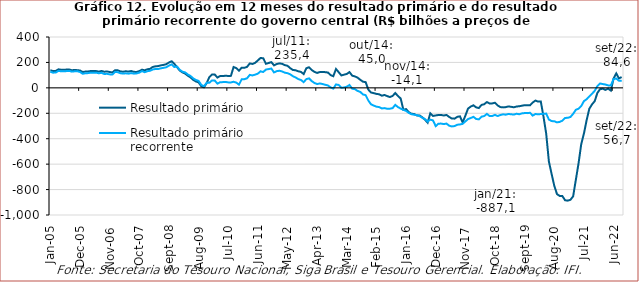
| Category | Resultado primário | Resultado primário recorrente |
|---|---|---|
| 2005-01-01 | 138531.934 | 126845.247 |
| 2005-02-01 | 131751.371 | 119556.587 |
| 2005-03-01 | 132781.991 | 120593.808 |
| 2005-04-01 | 145736.786 | 133448.149 |
| 2005-05-01 | 142403.822 | 130191.756 |
| 2005-06-01 | 141617.503 | 129638.461 |
| 2005-07-01 | 143922.7 | 131958.362 |
| 2005-08-01 | 144213.506 | 133589.352 |
| 2005-09-01 | 138586.273 | 127610.598 |
| 2005-10-01 | 140638.722 | 130078.924 |
| 2005-11-01 | 139155.237 | 131052.492 |
| 2005-12-01 | 136453.336 | 124784.345 |
| 2006-01-01 | 124463.596 | 110954.616 |
| 2006-02-01 | 128146.78 | 114944.174 |
| 2006-03-01 | 129056.641 | 115933.395 |
| 2006-04-01 | 132476.445 | 119697.92 |
| 2006-05-01 | 131896.698 | 119230.884 |
| 2006-06-01 | 132025.042 | 119389.463 |
| 2006-07-01 | 127285.375 | 114584.732 |
| 2006-08-01 | 133072.886 | 118286.966 |
| 2006-09-01 | 126878.573 | 108790.375 |
| 2006-10-01 | 128857.932 | 110724.688 |
| 2006-11-01 | 124811.13 | 106029.049 |
| 2006-12-01 | 120778.809 | 104847.308 |
| 2007-01-01 | 138678.331 | 124335.952 |
| 2007-02-01 | 138153.997 | 123558.717 |
| 2007-03-01 | 129393.725 | 114835.392 |
| 2007-04-01 | 126920.012 | 112463.498 |
| 2007-05-01 | 130498.1 | 114279.263 |
| 2007-06-01 | 127932.177 | 111670.366 |
| 2007-07-01 | 132746.637 | 116036.78 |
| 2007-08-01 | 125945.94 | 111731.299 |
| 2007-09-01 | 125112.752 | 113646.688 |
| 2007-10-01 | 131587.736 | 119844.829 |
| 2007-11-01 | 142993.571 | 131676.392 |
| 2007-12-01 | 138320.402 | 123034.624 |
| 2008-01-01 | 145926.44 | 130974.017 |
| 2008-02-01 | 149518.903 | 134275.316 |
| 2008-03-01 | 164587.816 | 144655.192 |
| 2008-04-01 | 168962.953 | 148550.956 |
| 2008-05-01 | 171392.515 | 148555.841 |
| 2008-06-01 | 176809.049 | 153522.264 |
| 2008-07-01 | 180643.634 | 157491.561 |
| 2008-08-01 | 185951.685 | 161870.638 |
| 2008-09-01 | 199515.718 | 174666.786 |
| 2008-10-01 | 209170.027 | 184457.618 |
| 2008-11-01 | 188829.821 | 164322.51 |
| 2008-12-01 | 163578.814 | 168216.622 |
| 2009-01-01 | 136662.417 | 141571.704 |
| 2009-02-01 | 122197.364 | 127339.916 |
| 2009-03-01 | 112245.694 | 121905.401 |
| 2009-04-01 | 95761.318 | 105453.686 |
| 2009-05-01 | 82389.225 | 93672.689 |
| 2009-06-01 | 63239.733 | 74823.938 |
| 2009-07-01 | 50347.673 | 61944.396 |
| 2009-08-01 | 43593.005 | 55218.229 |
| 2009-09-01 | 13266.666 | 23605.06 |
| 2009-10-01 | 4220.44 | 13145.053 |
| 2009-11-01 | 36572.157 | 39137.714 |
| 2009-12-01 | 84656.809 | 40143.083 |
| 2010-01-01 | 104873.546 | 58757.692 |
| 2010-02-01 | 104839.962 | 57778.869 |
| 2010-03-01 | 80982.131 | 33103.53 |
| 2010-04-01 | 93160.573 | 44238.373 |
| 2010-05-01 | 92758.315 | 45163.049 |
| 2010-06-01 | 95343.598 | 46609.278 |
| 2010-07-01 | 93596.732 | 43112.957 |
| 2010-08-01 | 94269.511 | 42470.875 |
| 2010-09-01 | 163809.634 | 47837.579 |
| 2010-10-01 | 155515.635 | 41194.178 |
| 2010-11-01 | 134697.377 | 25257.7 |
| 2010-12-01 | 158905.281 | 67422.154 |
| 2011-01-01 | 157792.894 | 68288.954 |
| 2011-02-01 | 165205.63 | 75372.758 |
| 2011-03-01 | 191943.598 | 101755.613 |
| 2011-04-01 | 187961.749 | 97686.997 |
| 2011-05-01 | 196924.015 | 104193.829 |
| 2011-06-01 | 215638.555 | 111662.254 |
| 2011-07-01 | 235425.314 | 130072.374 |
| 2011-08-01 | 232361.652 | 124614.446 |
| 2011-09-01 | 189557.398 | 143953.486 |
| 2011-10-01 | 195514.098 | 147611.423 |
| 2011-11-01 | 202447.238 | 152000.715 |
| 2011-12-01 | 176960.783 | 121318.929 |
| 2012-01-01 | 187519.224 | 131599.842 |
| 2012-02-01 | 192517.487 | 134300.385 |
| 2012-03-01 | 188919.488 | 129326.306 |
| 2012-04-01 | 178922.532 | 119312.241 |
| 2012-05-01 | 173854.376 | 115477.22 |
| 2012-06-01 | 155153.752 | 106575.77 |
| 2012-07-01 | 140746.383 | 91858.394 |
| 2012-08-01 | 138415.546 | 81787.79 |
| 2012-09-01 | 130276.446 | 69029.463 |
| 2012-10-01 | 125601.928 | 62031.869 |
| 2012-11-01 | 108333.911 | 44970.715 |
| 2012-12-01 | 154598.387 | 69016.402 |
| 2013-01-01 | 162017.89 | 74225.279 |
| 2013-02-01 | 140413.177 | 53197.728 |
| 2013-03-01 | 125987.983 | 38339.785 |
| 2013-04-01 | 117616.166 | 30216.142 |
| 2013-05-01 | 124467.445 | 34301.742 |
| 2013-06-01 | 124590.754 | 30382.93 |
| 2013-07-01 | 123582.537 | 24047.78 |
| 2013-08-01 | 120496.468 | 18862.053 |
| 2013-09-01 | 100373.351 | 3614.413 |
| 2013-10-01 | 91831.398 | -5914.874 |
| 2013-11-01 | 148160.606 | 26799.244 |
| 2013-12-01 | 123158.253 | 22999.04 |
| 2014-01-01 | 97682.94 | 638.758 |
| 2014-02-01 | 103866.181 | 2993.799 |
| 2014-03-01 | 109373.401 | 8964.422 |
| 2014-04-01 | 124056.97 | 22523.409 |
| 2014-05-01 | 95952.323 | -6520.776 |
| 2014-06-01 | 90240.689 | -9755.3 |
| 2014-07-01 | 80160.918 | -23770.396 |
| 2014-08-01 | 63643.396 | -31901.036 |
| 2014-09-01 | 48580.835 | -51712.005 |
| 2014-10-01 | 45033.857 | -57454.176 |
| 2014-11-01 | -14108.042 | -99824.06 |
| 2014-12-01 | -36650.368 | -129584.009 |
| 2015-01-01 | -41494.423 | -139171.708 |
| 2015-02-01 | -47404.174 | -147828.052 |
| 2015-03-01 | -50489.949 | -151390.193 |
| 2015-04-01 | -61858.475 | -161964.405 |
| 2015-05-01 | -56047.817 | -159121.691 |
| 2015-06-01 | -64944.733 | -164304.446 |
| 2015-07-01 | -72124.068 | -163956.359 |
| 2015-08-01 | -63396.224 | -159561.861 |
| 2015-09-01 | -40606.387 | -133874.113 |
| 2015-10-01 | -64479.054 | -151542.591 |
| 2015-11-01 | -83567.284 | -162822.182 |
| 2015-12-01 | -172210.593 | -172756.87 |
| 2016-01-01 | -167127.11 | -181328.974 |
| 2016-02-01 | -191010.049 | -196655.063 |
| 2016-03-01 | -203519.891 | -207153.424 |
| 2016-04-01 | -206271.883 | -211341.268 |
| 2016-05-01 | -216676.426 | -213952.584 |
| 2016-06-01 | -216693.169 | -221797.635 |
| 2016-07-01 | -231262.765 | -235250.219 |
| 2016-08-01 | -250203.688 | -245762.757 |
| 2016-09-01 | -273650.036 | -265166.589 |
| 2016-10-01 | -199798.331 | -249840.151 |
| 2016-11-01 | -220802.244 | -255864.35 |
| 2016-12-01 | -216952.695 | -301220.193 |
| 2017-01-01 | -213591.342 | -281704.096 |
| 2017-02-01 | -213214.388 | -281111.997 |
| 2017-03-01 | -217235.9 | -285059.025 |
| 2017-04-01 | -213094.619 | -281001.741 |
| 2017-05-01 | -228600.377 | -297779.245 |
| 2017-06-01 | -241530.702 | -303312.88 |
| 2017-07-01 | -242065.494 | -300506.965 |
| 2017-08-01 | -228033.551 | -289770.186 |
| 2017-09-01 | -224026.527 | -288257.912 |
| 2017-10-01 | -272186.916 | -282456.414 |
| 2017-11-01 | -219081.692 | -264082.547 |
| 2017-12-01 | -163031.508 | -245347.809 |
| 2018-01-01 | -147109.829 | -237246.802 |
| 2018-02-01 | -136977.855 | -227791.918 |
| 2018-03-01 | -153656.456 | -244543.329 |
| 2018-04-01 | -158755.872 | -247906.101 |
| 2018-05-01 | -134204.599 | -226515.628 |
| 2018-06-01 | -128729.49 | -221778.14 |
| 2018-07-01 | -111648.812 | -204755.143 |
| 2018-08-01 | -123141.418 | -221749.114 |
| 2018-09-01 | -122101.867 | -220887.547 |
| 2018-10-01 | -116854.154 | -212619.269 |
| 2018-11-01 | -138780.393 | -221561.413 |
| 2018-12-01 | -151183.123 | -213442.558 |
| 2019-01-01 | -153644.287 | -208156.311 |
| 2019-02-01 | -151494.277 | -210990.966 |
| 2019-03-01 | -145921.94 | -205323.984 |
| 2019-04-01 | -149087.615 | -207958.393 |
| 2019-05-01 | -153000.568 | -210125.857 |
| 2019-06-01 | -146738.009 | -203599.712 |
| 2019-07-01 | -144549.107 | -207565.654 |
| 2019-08-01 | -140272.852 | -200847.105 |
| 2019-09-01 | -136348.956 | -198252.027 |
| 2019-10-01 | -137646.793 | -198772.974 |
| 2019-11-01 | -137434.698 | -196038.939 |
| 2019-12-01 | -115310.228 | -218185.418 |
| 2020-01-01 | -99963.408 | -205730.678 |
| 2020-02-01 | -108183.317 | -207823.177 |
| 2020-03-01 | -107405.952 | -206062.075 |
| 2020-04-01 | -226503.025 | -203742.491 |
| 2020-05-01 | -360365.113 | -202457.677 |
| 2020-06-01 | -579026.005 | -249130.857 |
| 2020-07-01 | -676542.632 | -261268.998 |
| 2020-08-01 | -770286.99 | -262592.72 |
| 2020-09-01 | -835305.36 | -271349.306 |
| 2020-10-01 | -849880.785 | -267838.3 |
| 2020-11-01 | -851005.108 | -258086.509 |
| 2020-12-01 | -884038.735 | -236693.32 |
| 2021-01-01 | -887055.552 | -235501.479 |
| 2021-02-01 | -880412.703 | -228971.608 |
| 2021-03-01 | -852956.356 | -204387.333 |
| 2021-04-01 | -723200.956 | -172426.74 |
| 2021-05-01 | -594586.138 | -164041.862 |
| 2021-06-01 | -442621.445 | -143513.279 |
| 2021-07-01 | -359214.31 | -104308.251 |
| 2021-08-01 | -254814.6 | -89593.663 |
| 2021-09-01 | -164218.131 | -67143.205 |
| 2021-10-01 | -130065.774 | -46310.068 |
| 2021-11-01 | -104476.619 | -23295.806 |
| 2021-12-01 | -39522.439 | 13495.024 |
| 2022-01-01 | -10049.324 | 34215.117 |
| 2022-02-01 | -7034.948 | 29749.613 |
| 2022-03-01 | -16126.306 | 26117.839 |
| 2022-04-01 | -5965.298 | 19210.572 |
| 2022-05-01 | -21771.995 | 19667.433 |
| 2022-06-01 | 73721.47 | 68664.756 |
| 2022-07-01 | 113871.615 | 73555.815 |
| 2022-08-01 | 73877.527 | 55968.924 |
| 2022-09-01 | 84591.587 | 56721.197 |